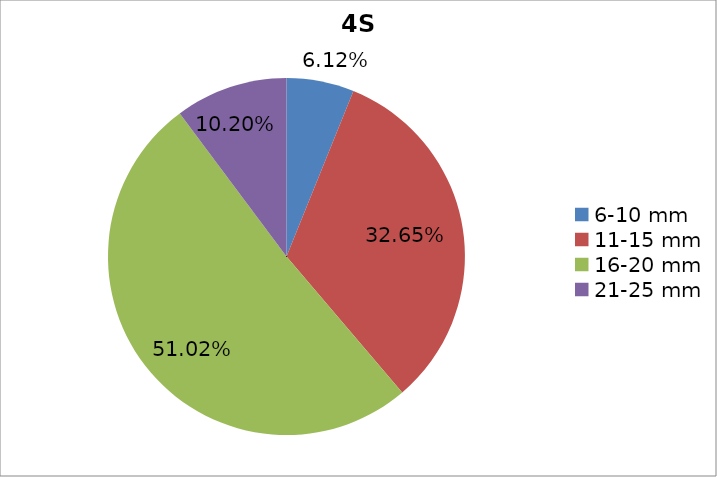
| Category | Series 0 |
|---|---|
| 6-10 mm | 0.061 |
| 11-15 mm | 0.326 |
| 16-20 mm | 0.51 |
| 21-25 mm | 0.102 |